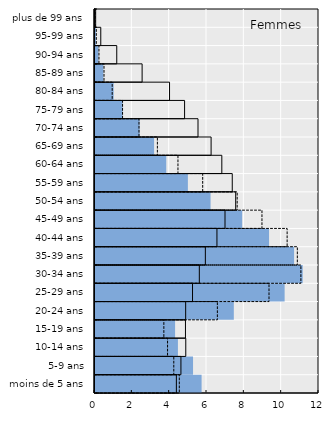
| Category | TCN | Ressortissants de l’UEs | Nationaux |
|---|---|---|---|
| moins de 5 ans | 5.71 | 4.517 | 4.359 |
| 5-9 ans | 5.252 | 4.221 | 4.603 |
| 10-14 ans | 4.442 | 3.887 | 4.863 |
| 15-19 ans | 4.29 | 3.688 | 4.846 |
| 20-24 ans | 7.436 | 6.555 | 4.857 |
| 25-29 ans | 10.159 | 9.322 | 5.225 |
| 30-34 ans | 11.126 | 11.029 | 5.588 |
| 35-39 ans | 10.665 | 10.84 | 5.912 |
| 40-44 ans | 9.325 | 10.293 | 6.532 |
| 45-49 ans | 7.885 | 8.945 | 6.964 |
| 50-54 ans | 6.191 | 7.617 | 7.538 |
| 55-59 ans | 4.976 | 5.77 | 7.353 |
| 60-64 ans | 3.817 | 4.445 | 6.794 |
| 65-69 ans | 3.166 | 3.342 | 6.22 |
| 70-74 ans | 2.392 | 2.356 | 5.518 |
| 75-79 ans | 1.479 | 1.476 | 4.799 |
| 80-84 ans | 0.999 | 0.921 | 3.993 |
| 85-89 ans | 0.446 | 0.482 | 2.524 |
| 90-94 ans | 0.184 | 0.212 | 1.166 |
| 95-99 ans | 0.05 | 0.07 | 0.309 |
| plus de 99 ans | 0.01 | 0.012 | 0.036 |